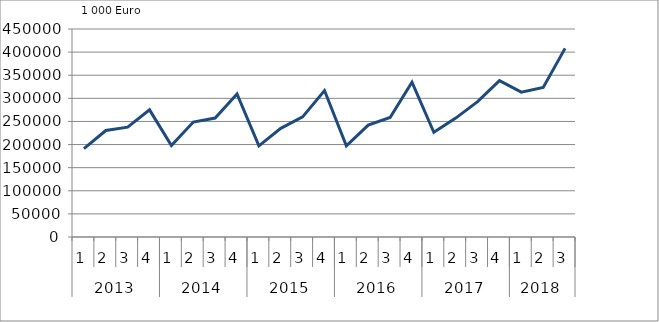
| Category | Ausbaugewerblicher Umsatz3 |
|---|---|
| 0 | 191088.978 |
| 1 | 230353.875 |
| 2 | 237735.574 |
| 3 | 275098.219 |
| 4 | 197732.754 |
| 5 | 248690.349 |
| 6 | 257339.084 |
| 7 | 309632.186 |
| 8 | 197030.42 |
| 9 | 235094.994 |
| 10 | 259758.438 |
| 11 | 316833.232 |
| 12 | 197219.532 |
| 13 | 242069.899 |
| 14 | 258547.84 |
| 15 | 334764.305 |
| 16 | 226552.317 |
| 17 | 257191.13 |
| 18 | 292853.372 |
| 19 | 338154.691 |
| 20 | 313433.569 |
| 21 | 323547.694 |
| 22 | 408057.42 |